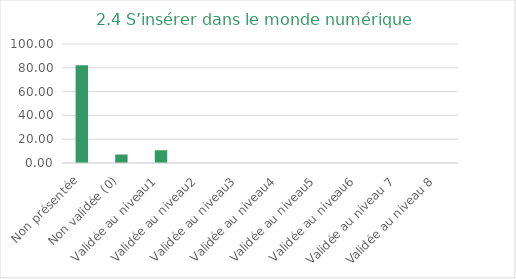
| Category | Series 0 |
|---|---|
| Non présentée | 82.143 |
| Non validée (0) | 7.143 |
| Validée au niveau1 | 10.714 |
| Validée au niveau2 | 0 |
| Validée au niveau3 | 0 |
| Validée au niveau4 | 0 |
| Validée au niveau5 | 0 |
| Validée au niveau6 | 0 |
| Validée au niveau 7 | 0 |
| Validée au niveau 8 | 0 |